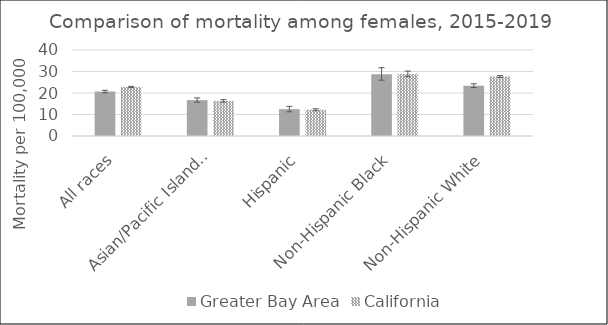
| Category | Greater Bay Area | California | US Mortality |
|---|---|---|---|
| All races | 20.66 | 22.79 |  |
| Asian/Pacific Islander | 16.69 | 16.32 |  |
| Hispanic | 12.48 | 12.21 |  |
| Non-Hispanic Black | 28.73 | 28.88 |  |
| Non-Hispanic White | 23.4 | 27.67 |  |